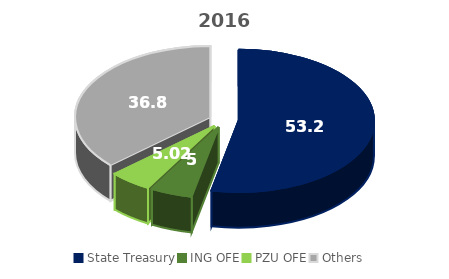
| Category | Series 0 |
|---|---|
| State Treasury | 53.2 |
| ING OFE | 5 |
| PZU OFE | 5.02 |
| Others | 36.78 |